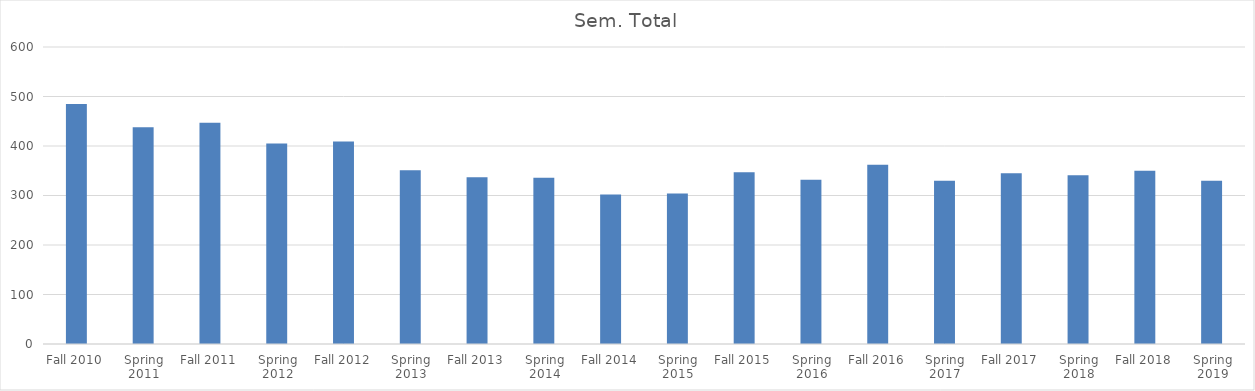
| Category | Sem. Total |
|---|---|
| Fall 2010 | 485 |
| Spring 2011 | 438 |
| Fall 2011 | 447 |
| Spring 2012 | 405 |
| Fall 2012 | 409 |
| Spring 2013 | 351 |
| Fall 2013 | 337 |
| Spring 2014 | 336 |
| Fall 2014 | 302 |
| Spring 2015 | 304 |
| Fall 2015 | 347 |
| Spring 2016 | 332 |
| Fall 2016 | 362 |
| Spring 2017 | 330 |
| Fall 2017 | 345 |
| Spring 2018 | 341 |
| Fall 2018 | 350 |
| Spring 2019 | 330 |